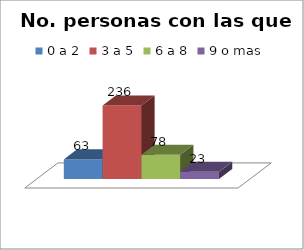
| Category | 0 a 2 | 3 a 5 | 6 a 8 | 9 o mas |
|---|---|---|---|---|
| 0 | 63 | 236 | 78 | 23 |